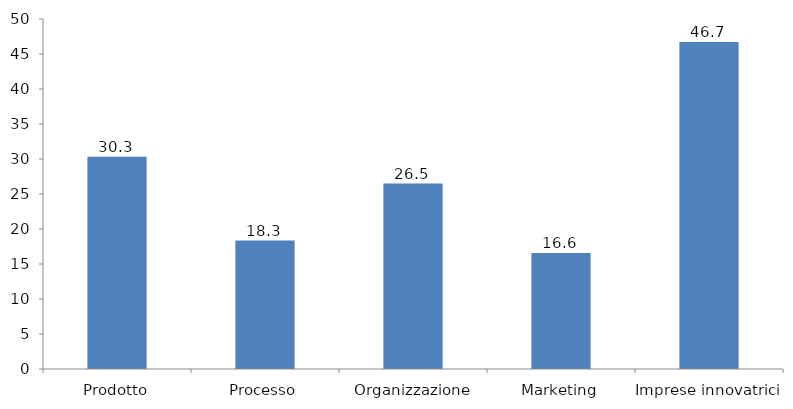
| Category | Series 0 |
|---|---|
| Prodotto | 30.313 |
| Processo | 18.346 |
| Organizzazione | 26.497 |
| Marketing | 16.559 |
| Imprese innovatrici | 46.7 |